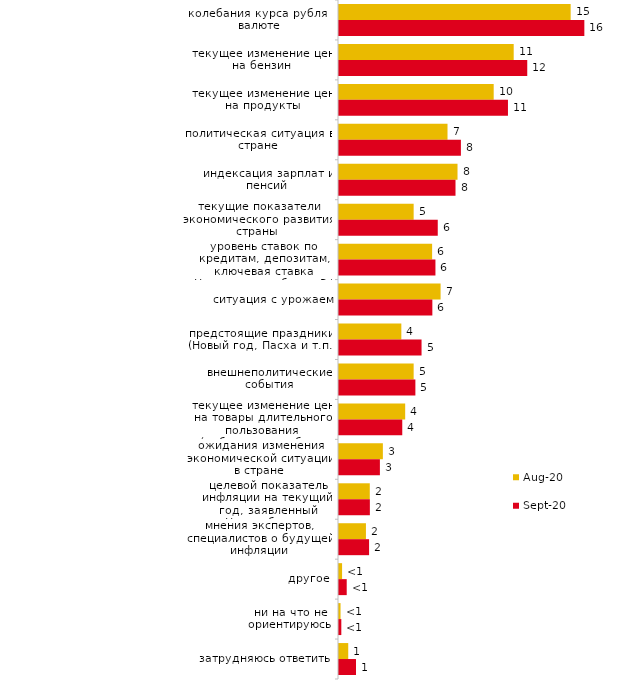
| Category | авг.20 | сен.20 |
|---|---|---|
| колебания курса рубля к валюте | 14.945 | 15.829 |
| текущее изменение цен на бензин | 11.271 | 12.145 |
| текущее изменение цен на продукты | 9.98 | 10.901 |
| политическая ситуация в стране | 7.001 | 7.865 |
| индексация зарплат и пенсий | 7.646 | 7.516 |
| текущие показатели экономического развития страны | 4.816 | 6.371 |
| уровень ставок по кредитам, депозитам, ключевая ставка Центрального банка РФ | 6.008 | 6.222 |
| ситуация с урожаем | 6.554 | 6.023 |
| предстоящие праздники (Новый год, Пасха и т.п.) | 4.022 | 5.326 |
| внешнеполитические события | 4.816 | 4.928 |
| текущее изменение цен на товары длительного пользования (мебель, автомобиль, бытовая техника и т.п.) | 4.27 | 4.082 |
| ожидания изменения экономической ситуации в стране | 2.83 | 2.638 |
| целевой показатель инфляции на текущий год, заявленный Центробанком | 1.986 | 1.991 |
| мнения экспертов, специалистов о будущей инфляции | 1.738 | 1.941 |
| другое | 0.199 | 0.498 |
| ни на что не ориентируюсь | 0.099 | 0.149 |
| затрудняюсь ответить | 0.596 | 1.095 |